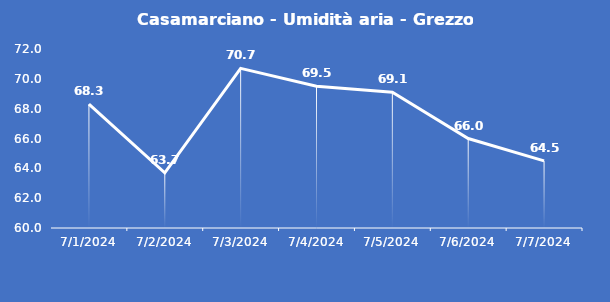
| Category | Casamarciano - Umidità aria - Grezzo (%) |
|---|---|
| 7/1/24 | 68.3 |
| 7/2/24 | 63.7 |
| 7/3/24 | 70.7 |
| 7/4/24 | 69.5 |
| 7/5/24 | 69.1 |
| 7/6/24 | 66 |
| 7/7/24 | 64.5 |